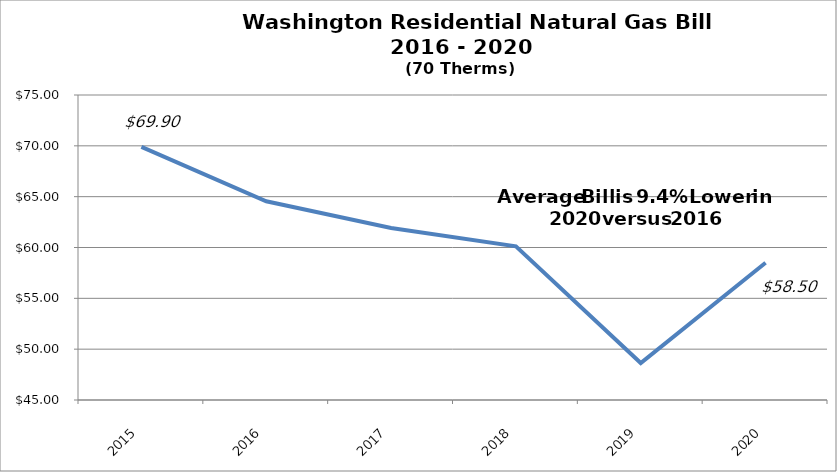
| Category | Washington Residential Natural Gas Bill (70 Therms) |
|---|---|
| 2015.0 | 69.899 |
| 2016.0 | 64.544 |
| 2017.0 | 61.919 |
| 2018.0 | 60.12 |
| 2019.0 | 48.635 |
| 2020.0 | 58.504 |